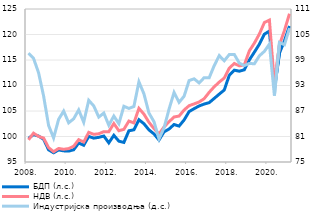
| Category | БДП (л.с.) | НДВ (л.с.) |
|---|---|---|
| 2008. | 99.637 | 99.347 |
| II | 100.363 | 100.653 |
| III | 100.09 | 100.02 |
| IV | 99.463 | 99.693 |
| 2009. | 97.39 | 97.82 |
| II | 96.81 | 97.017 |
| III | 97.364 | 97.657 |
| IV | 97.185 | 97.494 |
| 2010. | 97.141 | 97.629 |
| II | 97.393 | 98.081 |
| III | 98.725 | 99.386 |
| IV | 98.282 | 98.908 |
| 2011. | 100.008 | 100.814 |
| II | 99.679 | 100.421 |
| III | 99.834 | 100.537 |
| IV | 100.094 | 100.949 |
| 2012. | 98.756 | 100.943 |
| II | 100.237 | 102.542 |
| III | 99.086 | 101.133 |
| IV | 98.834 | 101.399 |
| 2013. | 101.117 | 103.027 |
| II | 101.317 | 102.659 |
| III | 103.295 | 105.518 |
| IV | 102.503 | 104.383 |
| 2014. | 101.299 | 102.779 |
| II | 100.5 | 101.573 |
| III | 99.315 | 100.481 |
| IV | 100.909 | 101.869 |
| 2015. | 101.462 | 102.896 |
| II | 102.35 | 103.826 |
| III | 102.041 | 104.008 |
| IV | 103.242 | 105.19 |
| 2016. | 104.89 | 106.043 |
| II | 105.459 | 106.394 |
| III | 105.992 | 106.773 |
| IV | 106.361 | 107.414 |
| 2017. | 106.639 | 108.665 |
| II | 107.466 | 109.749 |
| III | 108.304 | 110.663 |
| IV | 109.117 | 111.465 |
| 2018. | 111.986 | 113.4 |
| II | 113.006 | 114.32 |
| III | 112.805 | 113.851 |
| IV | 113.077 | 114.044 |
| 2019. | 115.016 | 116.792 |
| II | 116.535 | 118.302 |
| III | 118.097 | 120.099 |
| IV | 120.063 | 122.351 |
| 2020. | 120.675 | 122.82 |
| II | 109.422 | 110.178 |
| III | 116.35 | 117.985 |
| IV | 118.776 | 120.807 |
| 2021. | 121.687 | 124.078 |